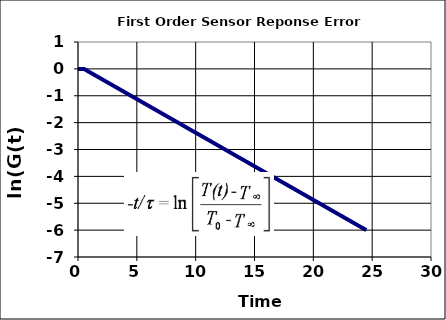
| Category | ln(G(t)) |
|---|---|
| 0.0 | 0 |
| 0.049 | 0 |
| 0.098 | 0 |
| 0.14700000000000002 | 0 |
| 0.196 | 0 |
| 0.245 | 0 |
| 0.294 | 0 |
| 0.34299999999999997 | 0 |
| 0.39199999999999996 | 0 |
| 0.44099999999999995 | 0 |
| 0.48999999999999994 | 0 |
| 0.5389999999999999 | -0.01 |
| 0.588 | -0.022 |
| 0.637 | -0.034 |
| 0.686 | -0.047 |
| 0.7350000000000001 | -0.059 |
| 0.7840000000000001 | -0.071 |
| 0.8330000000000002 | -0.083 |
| 0.8820000000000002 | -0.096 |
| 0.9310000000000003 | -0.108 |
| 0.9800000000000003 | -0.12 |
| 1.0290000000000004 | -0.132 |
| 1.0780000000000003 | -0.145 |
| 1.1270000000000002 | -0.157 |
| 1.1760000000000002 | -0.169 |
| 1.225 | -0.181 |
| 1.274 | -0.193 |
| 1.323 | -0.206 |
| 1.3719999999999999 | -0.218 |
| 1.4209999999999998 | -0.23 |
| 1.4699999999999998 | -0.242 |
| 1.5189999999999997 | -0.255 |
| 1.5679999999999996 | -0.267 |
| 1.6169999999999995 | -0.279 |
| 1.6659999999999995 | -0.291 |
| 1.7149999999999994 | -0.304 |
| 1.7639999999999993 | -0.316 |
| 1.8129999999999993 | -0.328 |
| 1.8619999999999992 | -0.34 |
| 1.9109999999999991 | -0.353 |
| 1.959999999999999 | -0.365 |
| 2.008999999999999 | -0.377 |
| 2.057999999999999 | -0.389 |
| 2.106999999999999 | -0.402 |
| 2.155999999999999 | -0.414 |
| 2.2049999999999987 | -0.426 |
| 2.2539999999999987 | -0.438 |
| 2.3029999999999986 | -0.451 |
| 2.3519999999999985 | -0.463 |
| 2.4009999999999985 | -0.475 |
| 2.4499999999999984 | -0.487 |
| 2.4989999999999983 | -0.5 |
| 2.5479999999999983 | -0.512 |
| 2.596999999999998 | -0.524 |
| 2.645999999999998 | -0.536 |
| 2.694999999999998 | -0.549 |
| 2.743999999999998 | -0.561 |
| 2.792999999999998 | -0.573 |
| 2.841999999999998 | -0.585 |
| 2.890999999999998 | -0.598 |
| 2.9399999999999977 | -0.61 |
| 2.9889999999999977 | -0.622 |
| 3.0379999999999976 | -0.634 |
| 3.0869999999999975 | -0.647 |
| 3.1359999999999975 | -0.659 |
| 3.1849999999999974 | -0.671 |
| 3.2339999999999973 | -0.683 |
| 3.2829999999999973 | -0.696 |
| 3.331999999999997 | -0.708 |
| 3.380999999999997 | -0.72 |
| 3.429999999999997 | -0.732 |
| 3.478999999999997 | -0.745 |
| 3.527999999999997 | -0.757 |
| 3.576999999999997 | -0.769 |
| 3.625999999999997 | -0.781 |
| 3.6749999999999967 | -0.794 |
| 3.7239999999999966 | -0.806 |
| 3.7729999999999966 | -0.818 |
| 3.8219999999999965 | -0.83 |
| 3.8709999999999964 | -0.843 |
| 3.9199999999999964 | -0.855 |
| 3.9689999999999963 | -0.867 |
| 4.017999999999996 | -0.879 |
| 4.066999999999997 | -0.892 |
| 4.115999999999997 | -0.904 |
| 4.164999999999997 | -0.916 |
| 4.213999999999998 | -0.928 |
| 4.262999999999998 | -0.941 |
| 4.3119999999999985 | -0.953 |
| 4.360999999999999 | -0.965 |
| 4.409999999999999 | -0.977 |
| 4.459 | -0.99 |
| 4.508 | -1.002 |
| 4.557 | -1.014 |
| 4.606000000000001 | -1.027 |
| 4.655000000000001 | -1.039 |
| 4.7040000000000015 | -1.051 |
| 4.753000000000002 | -1.063 |
| 4.802000000000002 | -1.076 |
| 4.851000000000003 | -1.088 |
| 4.900000000000003 | -1.1 |
| 4.949000000000003 | -1.112 |
| 4.998000000000004 | -1.125 |
| 5.047000000000004 | -1.137 |
| 5.0960000000000045 | -1.149 |
| 5.145000000000005 | -1.161 |
| 5.194000000000005 | -1.174 |
| 5.243000000000006 | -1.186 |
| 5.292000000000006 | -1.198 |
| 5.341000000000006 | -1.21 |
| 5.390000000000007 | -1.223 |
| 5.439000000000007 | -1.235 |
| 5.4880000000000075 | -1.247 |
| 5.537000000000008 | -1.259 |
| 5.586000000000008 | -1.272 |
| 5.635000000000009 | -1.284 |
| 5.684000000000009 | -1.296 |
| 5.733000000000009 | -1.308 |
| 5.78200000000001 | -1.321 |
| 5.83100000000001 | -1.333 |
| 5.8800000000000106 | -1.345 |
| 5.929000000000011 | -1.357 |
| 5.978000000000011 | -1.37 |
| 6.027000000000012 | -1.382 |
| 6.076000000000012 | -1.394 |
| 6.125000000000012 | -1.406 |
| 6.174000000000013 | -1.419 |
| 6.223000000000013 | -1.431 |
| 6.272000000000014 | -1.443 |
| 6.321000000000014 | -1.455 |
| 6.370000000000014 | -1.468 |
| 6.419000000000015 | -1.48 |
| 6.468000000000015 | -1.492 |
| 6.5170000000000154 | -1.504 |
| 6.566000000000016 | -1.517 |
| 6.615000000000016 | -1.529 |
| 6.664000000000017 | -1.541 |
| 6.713000000000017 | -1.553 |
| 6.762000000000017 | -1.566 |
| 6.811000000000018 | -1.578 |
| 6.860000000000018 | -1.59 |
| 6.9090000000000185 | -1.602 |
| 6.958000000000019 | -1.615 |
| 7.007000000000019 | -1.627 |
| 7.05600000000002 | -1.639 |
| 7.10500000000002 | -1.651 |
| 7.15400000000002 | -1.664 |
| 7.203000000000021 | -1.676 |
| 7.252000000000021 | -1.688 |
| 7.3010000000000215 | -1.7 |
| 7.350000000000022 | -1.713 |
| 7.399000000000022 | -1.725 |
| 7.448000000000023 | -1.737 |
| 7.497000000000023 | -1.749 |
| 7.546000000000023 | -1.762 |
| 7.595000000000024 | -1.774 |
| 7.644000000000024 | -1.786 |
| 7.6930000000000245 | -1.798 |
| 7.742000000000025 | -1.811 |
| 7.791000000000025 | -1.823 |
| 7.840000000000026 | -1.835 |
| 7.889000000000026 | -1.847 |
| 7.938000000000026 | -1.86 |
| 7.987000000000027 | -1.872 |
| 8.036000000000026 | -1.884 |
| 8.085000000000026 | -1.896 |
| 8.134000000000025 | -1.909 |
| 8.183000000000025 | -1.921 |
| 8.232000000000024 | -1.933 |
| 8.281000000000024 | -1.945 |
| 8.330000000000023 | -1.958 |
| 8.379000000000023 | -1.97 |
| 8.428000000000022 | -1.982 |
| 8.477000000000022 | -1.994 |
| 8.526000000000021 | -2.007 |
| 8.57500000000002 | -2.019 |
| 8.62400000000002 | -2.031 |
| 8.67300000000002 | -2.043 |
| 8.722000000000019 | -2.056 |
| 8.771000000000019 | -2.068 |
| 8.820000000000018 | -2.08 |
| 8.869000000000018 | -2.092 |
| 8.918000000000017 | -2.105 |
| 8.967000000000017 | -2.117 |
| 9.016000000000016 | -2.129 |
| 9.065000000000015 | -2.141 |
| 9.114000000000015 | -2.154 |
| 9.163000000000014 | -2.166 |
| 9.212000000000014 | -2.178 |
| 9.261000000000013 | -2.19 |
| 9.310000000000013 | -2.203 |
| 9.359000000000012 | -2.215 |
| 9.408000000000012 | -2.227 |
| 9.457000000000011 | -2.239 |
| 9.50600000000001 | -2.252 |
| 9.55500000000001 | -2.264 |
| 9.60400000000001 | -2.276 |
| 9.65300000000001 | -2.288 |
| 9.702000000000009 | -2.301 |
| 9.751000000000008 | -2.313 |
| 9.800000000000008 | -2.325 |
| 9.849000000000007 | -2.337 |
| 9.898000000000007 | -2.35 |
| 9.947000000000006 | -2.362 |
| 9.996000000000006 | -2.374 |
| 10.045000000000005 | -2.386 |
| 10.094000000000005 | -2.399 |
| 10.143000000000004 | -2.411 |
| 10.192000000000004 | -2.423 |
| 10.241000000000003 | -2.435 |
| 10.290000000000003 | -2.448 |
| 10.339000000000002 | -2.46 |
| 10.388000000000002 | -2.472 |
| 10.437000000000001 | -2.484 |
| 10.486 | -2.496 |
| 10.535 | -2.509 |
| 10.584 | -2.521 |
| 10.633 | -2.533 |
| 10.681999999999999 | -2.545 |
| 10.730999999999998 | -2.558 |
| 10.779999999999998 | -2.57 |
| 10.828999999999997 | -2.582 |
| 10.877999999999997 | -2.594 |
| 10.926999999999996 | -2.607 |
| 10.975999999999996 | -2.619 |
| 11.024999999999995 | -2.631 |
| 11.073999999999995 | -2.643 |
| 11.122999999999994 | -2.656 |
| 11.171999999999993 | -2.668 |
| 11.220999999999993 | -2.68 |
| 11.269999999999992 | -2.692 |
| 11.318999999999992 | -2.705 |
| 11.367999999999991 | -2.717 |
| 11.416999999999991 | -2.729 |
| 11.46599999999999 | -2.741 |
| 11.51499999999999 | -2.754 |
| 11.56399999999999 | -2.766 |
| 11.612999999999989 | -2.778 |
| 11.661999999999988 | -2.79 |
| 11.710999999999988 | -2.803 |
| 11.759999999999987 | -2.815 |
| 11.808999999999987 | -2.827 |
| 11.857999999999986 | -2.839 |
| 11.906999999999986 | -2.852 |
| 11.955999999999985 | -2.864 |
| 12.004999999999985 | -2.876 |
| 12.053999999999984 | -2.888 |
| 12.102999999999984 | -2.901 |
| 12.151999999999983 | -2.913 |
| 12.200999999999983 | -2.925 |
| 12.249999999999982 | -2.937 |
| 12.298999999999982 | -2.95 |
| 12.347999999999981 | -2.962 |
| 12.39699999999998 | -2.974 |
| 12.44599999999998 | -2.986 |
| 12.49499999999998 | -2.999 |
| 12.54399999999998 | -3.011 |
| 12.592999999999979 | -3.023 |
| 12.641999999999978 | -3.035 |
| 12.690999999999978 | -3.048 |
| 12.739999999999977 | -3.06 |
| 12.788999999999977 | -3.072 |
| 12.837999999999976 | -3.084 |
| 12.886999999999976 | -3.097 |
| 12.935999999999975 | -3.109 |
| 12.984999999999975 | -3.121 |
| 13.033999999999974 | -3.133 |
| 13.082999999999974 | -3.146 |
| 13.131999999999973 | -3.158 |
| 13.180999999999973 | -3.17 |
| 13.229999999999972 | -3.182 |
| 13.278999999999971 | -3.195 |
| 13.327999999999971 | -3.207 |
| 13.37699999999997 | -3.219 |
| 13.42599999999997 | -3.231 |
| 13.47499999999997 | -3.244 |
| 13.523999999999969 | -3.256 |
| 13.572999999999968 | -3.268 |
| 13.621999999999968 | -3.28 |
| 13.670999999999967 | -3.293 |
| 13.719999999999967 | -3.305 |
| 13.768999999999966 | -3.317 |
| 13.817999999999966 | -3.329 |
| 13.866999999999965 | -3.342 |
| 13.915999999999965 | -3.354 |
| 13.964999999999964 | -3.366 |
| 14.013999999999964 | -3.378 |
| 14.062999999999963 | -3.391 |
| 14.111999999999963 | -3.403 |
| 14.160999999999962 | -3.415 |
| 14.209999999999962 | -3.427 |
| 14.258999999999961 | -3.44 |
| 14.30799999999996 | -3.452 |
| 14.35699999999996 | -3.464 |
| 14.40599999999996 | -3.476 |
| 14.45499999999996 | -3.489 |
| 14.503999999999959 | -3.501 |
| 14.552999999999958 | -3.513 |
| 14.601999999999958 | -3.525 |
| 14.650999999999957 | -3.538 |
| 14.699999999999957 | -3.55 |
| 14.748999999999956 | -3.562 |
| 14.797999999999956 | -3.574 |
| 14.846999999999955 | -3.587 |
| 14.895999999999955 | -3.599 |
| 14.944999999999954 | -3.611 |
| 14.993999999999954 | -3.623 |
| 15.042999999999953 | -3.636 |
| 15.091999999999953 | -3.648 |
| 15.140999999999952 | -3.66 |
| 15.189999999999952 | -3.672 |
| 15.238999999999951 | -3.685 |
| 15.28799999999995 | -3.697 |
| 15.33699999999995 | -3.709 |
| 15.38599999999995 | -3.721 |
| 15.434999999999949 | -3.734 |
| 15.483999999999948 | -3.746 |
| 15.532999999999948 | -3.758 |
| 15.581999999999947 | -3.77 |
| 15.630999999999947 | -3.783 |
| 15.679999999999946 | -3.795 |
| 15.728999999999946 | -3.807 |
| 15.777999999999945 | -3.819 |
| 15.826999999999945 | -3.832 |
| 15.875999999999944 | -3.844 |
| 15.924999999999944 | -3.856 |
| 15.973999999999943 | -3.868 |
| 16.022999999999943 | -3.881 |
| 16.071999999999942 | -3.893 |
| 16.120999999999942 | -3.905 |
| 16.16999999999994 | -3.917 |
| 16.21899999999994 | -3.93 |
| 16.26799999999994 | -3.942 |
| 16.31699999999994 | -3.954 |
| 16.36599999999994 | -3.966 |
| 16.41499999999994 | -3.979 |
| 16.46399999999994 | -3.991 |
| 16.512999999999938 | -4.003 |
| 16.561999999999937 | -4.015 |
| 16.610999999999937 | -4.028 |
| 16.659999999999936 | -4.04 |
| 16.708999999999936 | -4.052 |
| 16.757999999999935 | -4.064 |
| 16.806999999999935 | -4.077 |
| 16.855999999999934 | -4.089 |
| 16.904999999999934 | -4.101 |
| 16.953999999999933 | -4.113 |
| 17.002999999999933 | -4.126 |
| 17.051999999999932 | -4.138 |
| 17.10099999999993 | -4.15 |
| 17.14999999999993 | -4.162 |
| 17.19899999999993 | -4.175 |
| 17.24799999999993 | -4.187 |
| 17.29699999999993 | -4.199 |
| 17.34599999999993 | -4.211 |
| 17.39499999999993 | -4.224 |
| 17.443999999999928 | -4.236 |
| 17.492999999999927 | -4.248 |
| 17.541999999999927 | -4.26 |
| 17.590999999999926 | -4.273 |
| 17.639999999999926 | -4.285 |
| 17.688999999999925 | -4.297 |
| 17.737999999999925 | -4.309 |
| 17.786999999999924 | -4.322 |
| 17.835999999999924 | -4.334 |
| 17.884999999999923 | -4.346 |
| 17.933999999999923 | -4.358 |
| 17.982999999999922 | -4.371 |
| 18.031999999999922 | -4.383 |
| 18.08099999999992 | -4.395 |
| 18.12999999999992 | -4.407 |
| 18.17899999999992 | -4.42 |
| 18.22799999999992 | -4.432 |
| 18.27699999999992 | -4.444 |
| 18.32599999999992 | -4.456 |
| 18.37499999999992 | -4.469 |
| 18.423999999999918 | -4.481 |
| 18.472999999999917 | -4.493 |
| 18.521999999999917 | -4.505 |
| 18.570999999999916 | -4.518 |
| 18.619999999999916 | -4.53 |
| 18.668999999999915 | -4.542 |
| 18.717999999999915 | -4.554 |
| 18.766999999999914 | -4.567 |
| 18.815999999999914 | -4.579 |
| 18.864999999999913 | -4.591 |
| 18.913999999999913 | -4.603 |
| 18.962999999999912 | -4.616 |
| 19.01199999999991 | -4.628 |
| 19.06099999999991 | -4.64 |
| 19.10999999999991 | -4.652 |
| 19.15899999999991 | -4.665 |
| 19.20799999999991 | -4.677 |
| 19.25699999999991 | -4.689 |
| 19.30599999999991 | -4.701 |
| 19.354999999999908 | -4.714 |
| 19.403999999999908 | -4.726 |
| 19.452999999999907 | -4.738 |
| 19.501999999999907 | -4.75 |
| 19.550999999999906 | -4.763 |
| 19.599999999999905 | -4.775 |
| 19.648999999999905 | -4.787 |
| 19.697999999999904 | -4.799 |
| 19.746999999999904 | -4.812 |
| 19.795999999999903 | -4.824 |
| 19.844999999999903 | -4.836 |
| 19.893999999999902 | -4.848 |
| 19.942999999999902 | -4.861 |
| 19.9919999999999 | -4.873 |
| 20.0409999999999 | -4.885 |
| 20.0899999999999 | -4.897 |
| 20.1389999999999 | -4.91 |
| 20.1879999999999 | -4.922 |
| 20.2369999999999 | -4.934 |
| 20.2859999999999 | -4.946 |
| 20.334999999999898 | -4.959 |
| 20.383999999999897 | -4.971 |
| 20.432999999999897 | -4.983 |
| 20.481999999999896 | -4.995 |
| 20.530999999999896 | -5.008 |
| 20.579999999999895 | -5.02 |
| 20.628999999999895 | -5.032 |
| 20.677999999999894 | -5.044 |
| 20.726999999999894 | -5.057 |
| 20.775999999999893 | -5.069 |
| 20.824999999999893 | -5.081 |
| 20.873999999999892 | -5.093 |
| 20.92299999999989 | -5.106 |
| 20.97199999999989 | -5.118 |
| 21.02099999999989 | -5.13 |
| 21.06999999999989 | -5.142 |
| 21.11899999999989 | -5.155 |
| 21.16799999999989 | -5.167 |
| 21.21699999999989 | -5.179 |
| 21.265999999999888 | -5.191 |
| 21.314999999999888 | -5.204 |
| 21.363999999999887 | -5.216 |
| 21.412999999999887 | -5.228 |
| 21.461999999999886 | -5.24 |
| 21.510999999999886 | -5.253 |
| 21.559999999999885 | -5.265 |
| 21.608999999999885 | -5.277 |
| 21.657999999999884 | -5.289 |
| 21.706999999999883 | -5.302 |
| 21.755999999999883 | -5.314 |
| 21.804999999999882 | -5.326 |
| 21.853999999999882 | -5.338 |
| 21.90299999999988 | -5.351 |
| 21.95199999999988 | -5.363 |
| 22.00099999999988 | -5.375 |
| 22.04999999999988 | -5.387 |
| 22.09899999999988 | -5.4 |
| 22.14799999999988 | -5.412 |
| 22.19699999999988 | -5.424 |
| 22.245999999999878 | -5.436 |
| 22.294999999999877 | -5.449 |
| 22.343999999999877 | -5.461 |
| 22.392999999999876 | -5.473 |
| 22.441999999999876 | -5.485 |
| 22.490999999999875 | -5.498 |
| 22.539999999999875 | -5.51 |
| 22.588999999999874 | -5.522 |
| 22.637999999999874 | -5.534 |
| 22.686999999999873 | -5.547 |
| 22.735999999999873 | -5.559 |
| 22.784999999999872 | -5.571 |
| 22.83399999999987 | -5.583 |
| 22.88299999999987 | -5.596 |
| 22.93199999999987 | -5.608 |
| 22.98099999999987 | -5.62 |
| 23.02999999999987 | -5.632 |
| 23.07899999999987 | -5.645 |
| 23.12799999999987 | -5.657 |
| 23.176999999999868 | -5.669 |
| 23.225999999999868 | -5.681 |
| 23.274999999999867 | -5.694 |
| 23.323999999999867 | -5.706 |
| 23.372999999999866 | -5.718 |
| 23.421999999999866 | -5.73 |
| 23.470999999999865 | -5.743 |
| 23.519999999999865 | -5.755 |
| 23.568999999999864 | -5.767 |
| 23.617999999999864 | -5.779 |
| 23.666999999999863 | -5.792 |
| 23.715999999999863 | -5.804 |
| 23.764999999999862 | -5.816 |
| 23.81399999999986 | -5.828 |
| 23.86299999999986 | -5.841 |
| 23.91199999999986 | -5.853 |
| 23.96099999999986 | -5.865 |
| 24.00999999999986 | -5.877 |
| 24.05899999999986 | -5.89 |
| 24.10799999999986 | -5.902 |
| 24.156999999999858 | -5.914 |
| 24.205999999999857 | -5.926 |
| 24.254999999999857 | -5.939 |
| 24.303999999999856 | -5.951 |
| 24.352999999999856 | -5.963 |
| 24.401999999999855 | -5.975 |
| 24.450999999999855 | -5.988 |
| 24.499999999999854 | -6 |